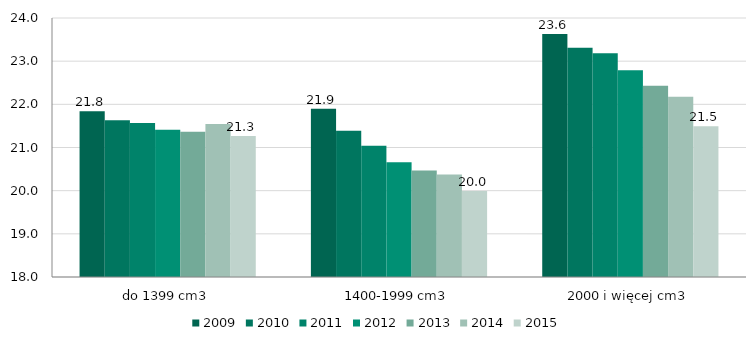
| Category | 2009 | 2010 | 2011 | 2012 | 2013 | 2014 | 2015 |
|---|---|---|---|---|---|---|---|
| do 1399 cm3 | 21.838 | 21.631 | 21.567 | 21.411 | 21.363 | 21.544 | 21.267 |
| 1400-1999 cm3 | 21.9 | 21.389 | 21.042 | 20.66 | 20.467 | 20.372 | 19.993 |
| 2000 i więcej cm3 | 23.629 | 23.31 | 23.186 | 22.791 | 22.431 | 22.176 | 21.494 |